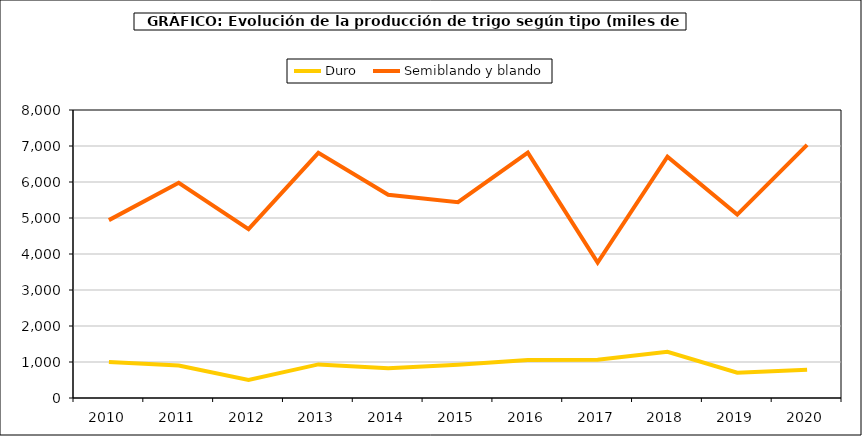
| Category | Duro | Semiblando y blando |
|---|---|---|
| 2010 | 999.861 | 4941.336 |
| 2011 | 900.352 | 5976.299 |
| 2012 | 499.493 | 4690.335 |
| 2013 | 933.268 | 6811.661 |
| 2014 | 825.433 | 5647.301 |
| 2015 | 924.956 | 5437.736 |
| 2016 | 1057.913 | 6815.222 |
| 2017 | 1061.648 | 3763.461 |
| 2018 | 1282.494 | 6703.231 |
| 2019 | 704.086 | 5094.609 |
| 2020 | 787.455 | 7029.605 |